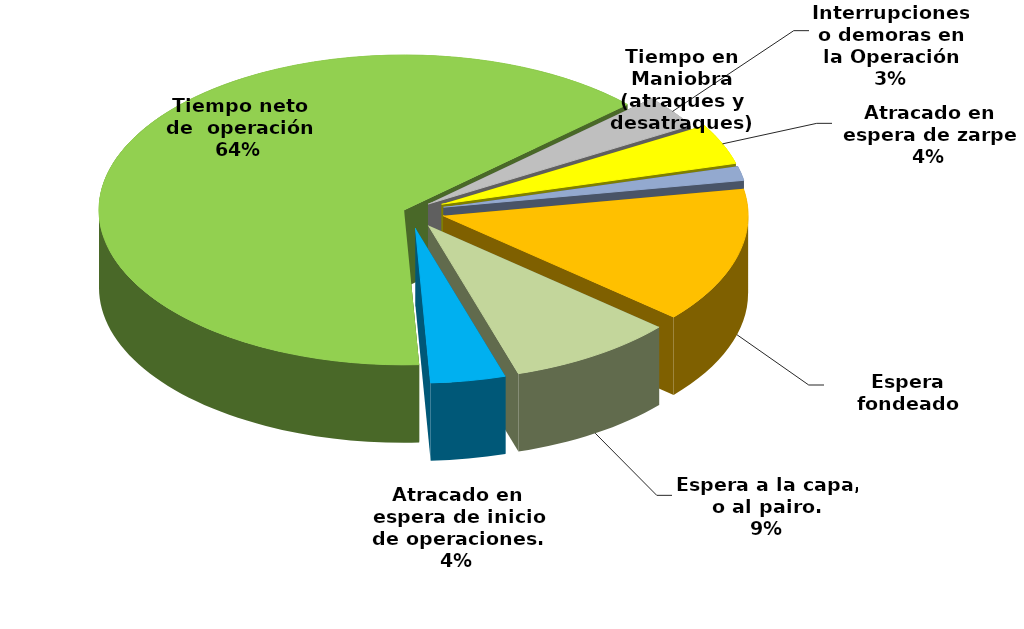
| Category | Series 0 |
|---|---|
| Espera fondeado | 11178.65 |
| Espera a la capa, o al pairo. | 7023.217 |
| Atracado en espera de inicio de operaciones. | 3141.491 |
| Tiempo neto de  operación | 50512.353 |
| Interrupciones o demoras en la Operación | 2723.43 |
| Atracado en espera de zarpe | 3341.483 |
| Tiempo en Maniobra (atraques y desatraques) | 1169.433 |